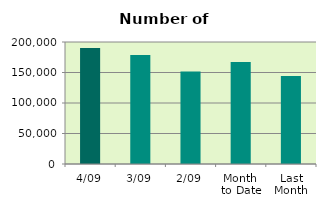
| Category | Series 0 |
|---|---|
| 4/09 | 190172 |
| 3/09 | 178688 |
| 2/09 | 151614 |
| Month 
to Date | 167149 |
| Last
Month | 144368.095 |